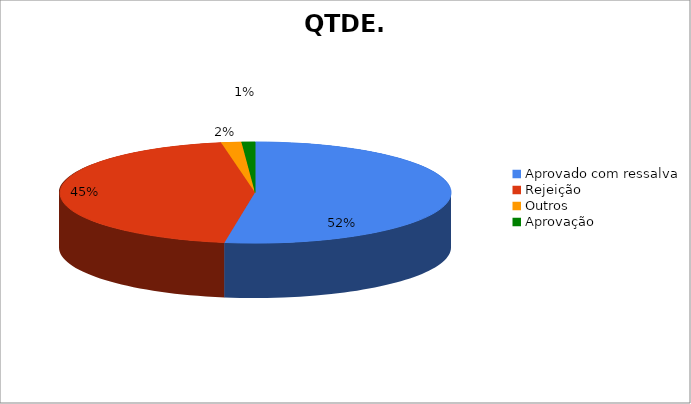
| Category | QTDE. |
|---|---|
| Aprovado com ressalva | 95 |
| Rejeição | 81 |
| Outros | 3 |
| Aprovação | 2 |